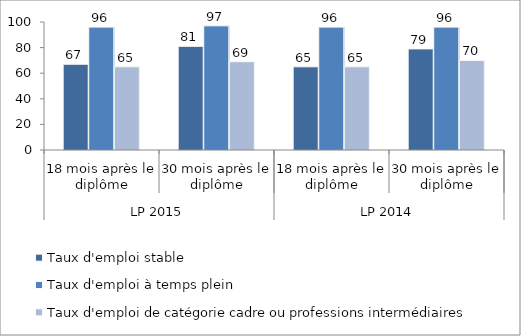
| Category | Taux d'emploi stable | Taux d'emploi à temps plein | Taux d'emploi de catégorie cadre ou professions intermédiaires |
|---|---|---|---|
| 0 | 67 | 96 | 65 |
| 1 | 81 | 97 | 69 |
| 2 | 65 | 96 | 65 |
| 3 | 79 | 96 | 70 |